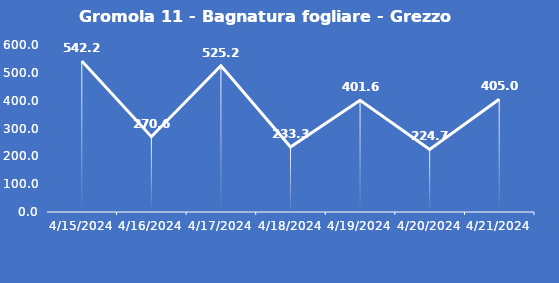
| Category | Gromola 11 - Bagnatura fogliare - Grezzo (min) |
|---|---|
| 4/15/24 | 542.2 |
| 4/16/24 | 270.6 |
| 4/17/24 | 525.2 |
| 4/18/24 | 233.3 |
| 4/19/24 | 401.6 |
| 4/20/24 | 224.7 |
| 4/21/24 | 405 |